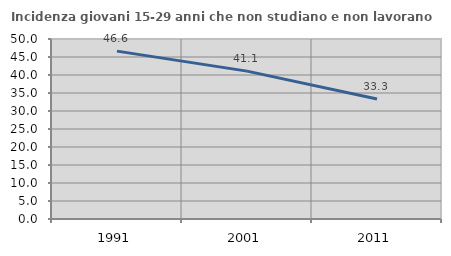
| Category | Incidenza giovani 15-29 anni che non studiano e non lavorano  |
|---|---|
| 1991.0 | 46.629 |
| 2001.0 | 41.077 |
| 2011.0 | 33.333 |